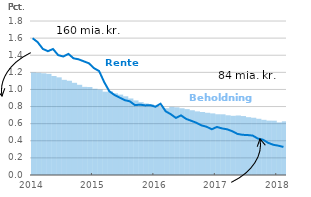
| Category | Beholdning (mia. kr.) |
|---|---|
| 0 | 159.721 |
| 1900-01-01 | 159.284 |
| 1900-01-02 | 158.535 |
| 1900-01-03 | 157.623 |
| 1900-01-04 | 154.283 |
| 1900-01-05 | 152.198 |
| 1900-01-06 | 148.312 |
| 1900-01-07 | 146.919 |
| 1900-01-08 | 143.681 |
| 1900-01-09 | 140.607 |
| 1900-01-10 | 137.389 |
| 1900-01-11 | 137.135 |
| 1900-01-12 | 134.384 |
| 1900-01-13 | 133.308 |
| 1900-01-14 | 129.841 |
| 1900-01-15 | 130.474 |
| 1900-01-16 | 127.315 |
| 1900-01-17 | 125.292 |
| 1900-01-18 | 122.65 |
| 1900-01-19 | 119.295 |
| 1900-01-20 | 116.251 |
| 1900-01-21 | 113.553 |
| 1900-01-22 | 111.528 |
| 1900-01-23 | 110.257 |
| 1900-01-24 | 106.676 |
| 1900-01-25 | 105.782 |
| 1900-01-26 | 103.999 |
| 1900-01-27 | 106.201 |
| 1900-01-28 | 105.52 |
| 1900-01-29 | 104.029 |
| 1900-01-30 | 102.709 |
| 1900-01-31 | 100.919 |
| 1900-02-01 | 99.181 |
| 1900-02-02 | 98.195 |
| 1900-02-03 | 96.985 |
| 1900-02-04 | 96.048 |
| 1900-02-05 | 94.676 |
| 1900-02-06 | 94.605 |
| 1900-02-07 | 93.086 |
| 1900-02-08 | 92.244 |
| 1900-02-09 | 92.769 |
| 1900-02-10 | 91.887 |
| 1900-02-11 | 90.142 |
| 1900-02-12 | 89.229 |
| 1900-02-13 | 87.635 |
| 1900-02-14 | 85.991 |
| 1900-02-15 | 84.774 |
| 1900-02-16 | 84.674 |
| 1900-02-17 | 81.952 |
| 1900-02-18 | 83.654 |